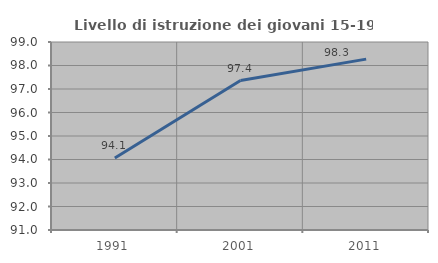
| Category | Livello di istruzione dei giovani 15-19 anni |
|---|---|
| 1991.0 | 94.068 |
| 2001.0 | 97.361 |
| 2011.0 | 98.271 |